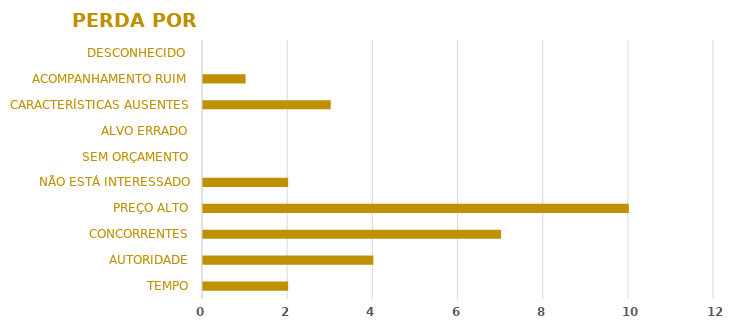
| Category | Series 0 |
|---|---|
| TEMPO | 2 |
| AUTORIDADE | 4 |
| CONCORRENTES | 7 |
| PREÇO ALTO | 10 |
| NÃO ESTÁ INTERESSADO | 2 |
| SEM ORÇAMENTO | 0 |
| ALVO ERRADO | 0 |
| CARACTERÍSTICAS AUSENTES | 3 |
| ACOMPANHAMENTO RUIM | 1 |
| DESCONHECIDO  | 0 |